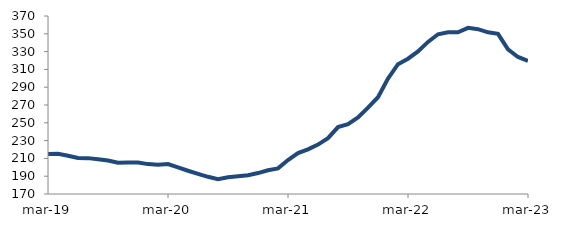
| Category | Series 0 |
|---|---|
| 2019-03-01 | 214.996 |
| 2019-04-01 | 215.22 |
| 2019-05-01 | 213.044 |
| 2019-06-01 | 210.411 |
| 2019-07-01 | 210.303 |
| 2019-08-01 | 209.058 |
| 2019-09-01 | 207.556 |
| 2019-10-01 | 205.179 |
| 2019-11-01 | 205.444 |
| 2019-12-01 | 205.45 |
| 2020-01-01 | 203.595 |
| 2020-02-01 | 202.996 |
| 2020-03-01 | 203.606 |
| 2020-04-01 | 199.997 |
| 2020-05-01 | 196.129 |
| 2020-06-01 | 192.644 |
| 2020-07-01 | 189.309 |
| 2020-08-01 | 186.635 |
| 2020-09-01 | 188.903 |
| 2020-10-01 | 189.967 |
| 2020-11-01 | 191.14 |
| 2020-12-01 | 193.522 |
| 2021-01-01 | 196.705 |
| 2021-02-01 | 198.76 |
| 2021-03-01 | 208.155 |
| 2021-04-01 | 215.916 |
| 2021-05-01 | 220.213 |
| 2021-06-01 | 225.532 |
| 2021-07-01 | 232.751 |
| 2021-08-01 | 245.217 |
| 2021-09-01 | 248.367 |
| 2021-10-01 | 256.011 |
| 2021-11-01 | 267.005 |
| 2021-12-01 | 278.738 |
| 2022-01-01 | 299.641 |
| 2022-02-01 | 315.847 |
| 2022-03-01 | 321.979 |
| 2022-04-01 | 330.13 |
| 2022-05-01 | 340.885 |
| 2022-06-01 | 349.463 |
| 2022-07-01 | 351.79 |
| 2022-08-01 | 351.673 |
| 2022-09-01 | 356.67 |
| 2022-10-01 | 355.158 |
| 2022-11-01 | 351.634 |
| 2022-12-01 | 349.966 |
| 2023-01-01 | 332.533 |
| 2023-02-01 | 323.969 |
| 2023-03-01 | 319.613 |